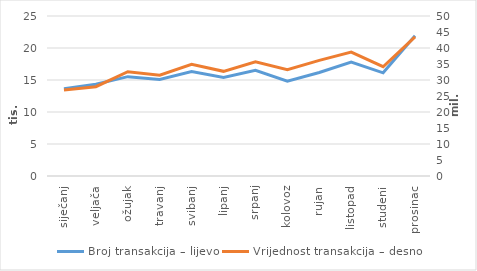
| Category | Broj transakcija – lijevo |
|---|---|
| siječanj | 13640 |
| veljača | 14333 |
| ožujak | 15521 |
| travanj | 15085 |
| svibanj | 16311 |
| lipanj | 15406 |
| srpanj | 16513 |
| kolovoz | 14828 |
| rujan | 16167 |
| listopad | 17798 |
| studeni | 16125 |
| prosinac | 21901 |